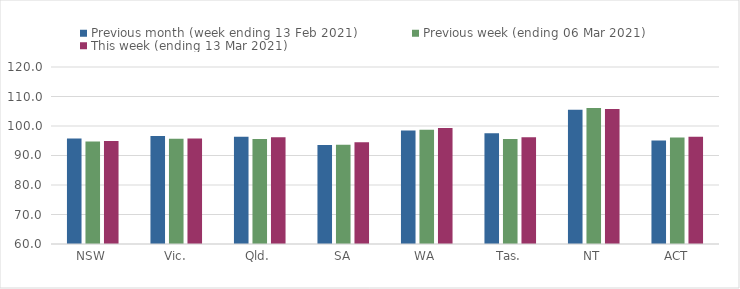
| Category | Previous month (week ending 13 Feb 2021) | Previous week (ending 06 Mar 2021) | This week (ending 13 Mar 2021) |
|---|---|---|---|
| NSW | 95.76 | 94.75 | 94.88 |
| Vic. | 96.61 | 95.7 | 95.75 |
| Qld. | 96.33 | 95.58 | 96.21 |
| SA | 93.58 | 93.62 | 94.45 |
| WA | 98.46 | 98.75 | 99.28 |
| Tas. | 97.58 | 95.62 | 96.21 |
| NT | 105.54 | 106.11 | 105.73 |
| ACT | 95.09 | 96.12 | 96.32 |